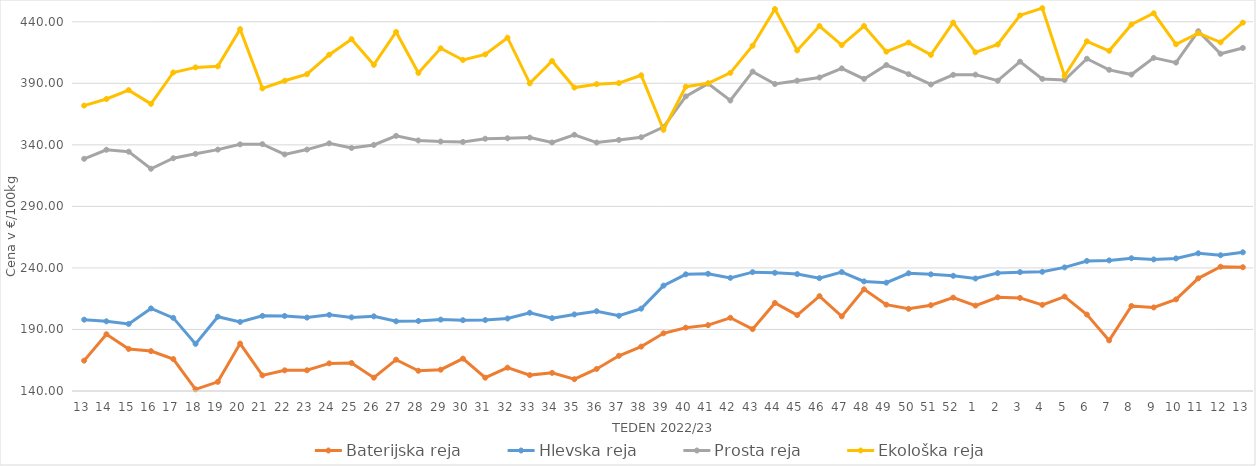
| Category | Baterijska reja | Hlevska reja | Prosta reja | Ekološka reja |
|---|---|---|---|---|
| 13.0 | 164.66 | 197.95 | 328.67 | 371.9 |
| 14.0 | 186.11 | 196.59 | 336.02 | 377.24 |
| 15.0 | 174.18 | 194.49 | 334.46 | 384.48 |
| 16.0 | 172.42 | 207.1 | 320.58 | 373.28 |
| 17.0 | 165.96 | 199.41 | 329.11 | 398.79 |
| 18.0 | 141.36 | 178.29 | 332.71 | 402.93 |
| 19.0 | 147.43 | 200.37 | 336.11 | 403.79 |
| 20.0 | 178.51 | 196.16 | 340.4 | 433.97 |
| 21.0 | 152.67 | 201.05 | 340.55 | 385.86 |
| 22.0 | 156.8 | 200.98 | 332.23 | 392.07 |
| 23.0 | 156.84 | 199.63 | 336.16 | 397.41 |
| 24.0 | 162.44 | 201.86 | 341.24 | 413.28 |
| 25.0 | 162.78 | 199.81 | 337.48 | 425.86 |
| 26.0 | 150.82 | 200.65 | 339.9 | 405 |
| 27.0 | 165.45 | 196.64 | 347.3 | 431.72 |
| 28.0 | 156.46 | 196.88 | 343.56 | 398.45 |
| 29.0 | 157.31 | 198.03 | 342.71 | 418.45 |
| 30.0 | 166.29 | 197.55 | 342.35 | 408.97 |
| 31.0 | 150.81 | 197.66 | 344.97 | 413.45 |
| 32.0 | 158.99 | 198.9 | 345.35 | 427.07 |
| 33.0 | 152.91 | 203.57 | 345.9 | 390 |
| 34.0 | 154.73 | 199.17 | 341.92 | 408.1 |
| 35.0 | 149.6 | 202.21 | 348.2 | 386.55 |
| 36.0 | 157.93 | 204.81 | 341.85 | 389.31 |
| 37.0 | 168.61 | 201.11 | 343.97 | 390.17 |
| 38.0 | 176.07 | 206.91 | 346.16 | 396.55 |
| 39.0 | 186.86 | 225.6 | 354.41 | 352.24 |
| 40.0 | 191.45 | 234.79 | 379.35 | 387.24 |
| 41.0 | 193.52 | 235.24 | 389.75 | 390 |
| 42.0 | 199.51 | 231.92 | 376.02 | 398.45 |
| 43.0 | 190.28 | 236.56 | 399.51 | 420.52 |
| 44.0 | 211.53 | 236.04 | 389.44 | 450.35 |
| 45.0 | 201.69 | 235.01 | 392.15 | 416.72 |
| 46.0 | 217.08 | 231.68 | 394.71 | 436.55 |
| 47.0 | 200.62 | 236.65 | 402.12 | 421.03 |
| 48.0 | 222.61 | 229.05 | 393.56 | 436.55 |
| 49.0 | 210.16 | 228.03 | 404.87 | 415.69 |
| 50.0 | 206.76 | 235.63 | 397.4 | 423.1 |
| 51.0 | 209.69 | 234.79 | 389.05 | 413.1 |
| 52.0 | 215.87 | 233.58 | 396.87 | 439.31 |
| 1.0 | 209.37 | 231.41 | 397.04 | 415.17 |
| 2.0 | 216.15 | 235.78 | 392.13 | 421.55 |
| 3.0 | 215.63 | 236.58 | 407.61 | 445.17 |
| 4.0 | 210 | 236.85 | 393.58 | 451.04 |
| 5.0 | 216.7 | 240.42 | 392.67 | 396.03 |
| 6.0 | 202.1 | 245.67 | 409.97 | 424.14 |
| 7.0 | 181.11 | 246.12 | 400.94 | 416.38 |
| 8.0 | 209.08 | 247.88 | 397.11 | 437.76 |
| 9.0 | 207.87 | 246.89 | 410.64 | 446.9 |
| 10.0 | 214.42 | 247.73 | 406.8 | 421.72 |
| 11.0 | 231.56 | 251.88 | 432.34 | 430.69 |
| 12.0 | 240.97 | 250.3 | 414 | 423.28 |
| 13.0 | 240.55 | 252.7 | 418.74 | 439.31 |